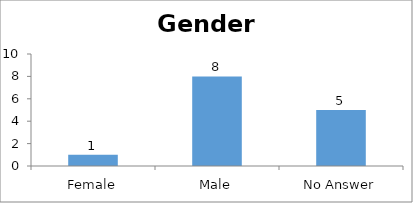
| Category | Gender |
|---|---|
| Female | 1 |
| Male | 8 |
| No Answer | 5 |